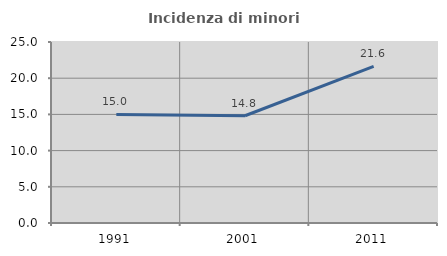
| Category | Incidenza di minori stranieri |
|---|---|
| 1991.0 | 15 |
| 2001.0 | 14.815 |
| 2011.0 | 21.635 |